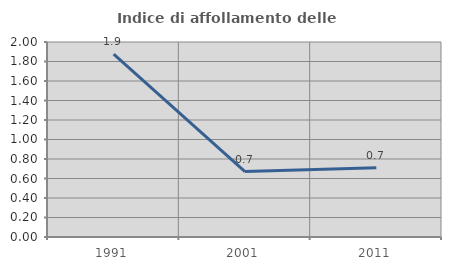
| Category | Indice di affollamento delle abitazioni  |
|---|---|
| 1991.0 | 1.875 |
| 2001.0 | 0.671 |
| 2011.0 | 0.71 |